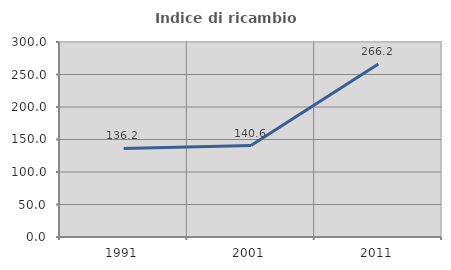
| Category | Indice di ricambio occupazionale  |
|---|---|
| 1991.0 | 136.199 |
| 2001.0 | 140.603 |
| 2011.0 | 266.154 |